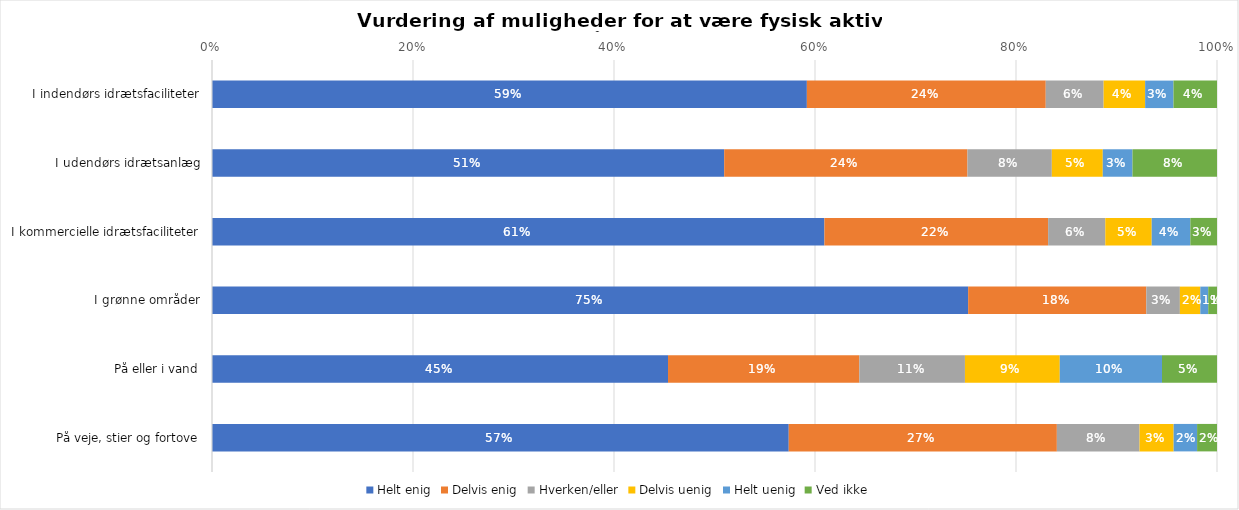
| Category | Helt enig | Delvis enig | Hverken/eller | Delvis uenig | Helt uenig | Ved ikke |
|---|---|---|---|---|---|---|
| I indendørs idrætsfaciliteter | 0.592 | 0.238 | 0.058 | 0.041 | 0.028 | 0.043 |
| I udendørs idrætsanlæg | 0.51 | 0.242 | 0.084 | 0.051 | 0.03 | 0.084 |
| I kommercielle idrætsfaciliteter | 0.609 | 0.223 | 0.057 | 0.046 | 0.038 | 0.027 |
| I grønne områder | 0.752 | 0.177 | 0.033 | 0.02 | 0.008 | 0.009 |
| På eller i vand | 0.454 | 0.19 | 0.105 | 0.094 | 0.102 | 0.055 |
| På veje, stier og fortove | 0.574 | 0.267 | 0.082 | 0.034 | 0.023 | 0.02 |